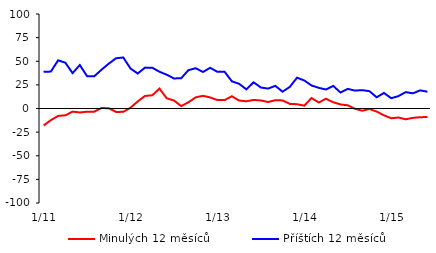
| Category | Minulých 12 měsíců | Příštích 12 měsíců |
|---|---|---|
|  1/11 | -17.96 | 38.89 |
|  2/11 | -12.33 | 39.05 |
|  3/11 | -7.84 | 50.96 |
|  4/11 | -7.2 | 48.47 |
|  5/11 | -3.3 | 37.42 |
|  6/11 | -4.21 | 45.99 |
|  7/11 | -3.33 | 34.17 |
|  8/11 | -3.33 | 34.17 |
|  9/11 | 0.51 | 41.09 |
|  10/11 | 0.28 | 47.47 |
|  11/11 | -3.65 | 53.17 |
|  12/11 | -3.52 | 53.99 |
|  1/12 | 0.85 | 42.3 |
|  2/12 | 7.49 | 37.02 |
|  3/12 | 13.29 | 43.26 |
|  4/12 | 13.96 | 43.14 |
|  5/12 | 21.08 | 38.87 |
|  6/12 | 10.81 | 35.74 |
|  7/12 | 8.46 | 31.81 |
|  8/12 | 2.55 | 32.03 |
|  9/12 | 6.58 | 40.6 |
|  10/12 | 11.79 | 42.65 |
|  11/12 | 13.41 | 38.66 |
|  12/12 | 11.71 | 43.07 |
|  1/13 | 8.92 | 38.82 |
|  2/13 | 8.92 | 38.82 |
|  3/13 | 12.98 | 28.75 |
|  4/13 | 8.4 | 26.12 |
|  5/13 | 7.64 | 20.26 |
|  6/13 | 9.1 | 27.71 |
|  7/13 | 8.51 | 22.2 |
|  8/13 | 6.89 | 21.06 |
|  9/13 | 8.81 | 23.95 |
|  10/13 | 8.54 | 17.76 |
|  11/13 | 4.88 | 22.87 |
|  12/13 | 4.53 | 32.62 |
|  1/14 | 2.99 | 29.64 |
|  2/14 | 11.1 | 24.37 |
|  3/14 | 6.35 | 21.86 |
|  4/14 | 10.34 | 20.09 |
|  5/14 | 6.57 | 23.91 |
|  6/14 | 4.33 | 16.91 |
|  7/14 | 3.35 | 20.75 |
|  8/14 | -0.33 | 18.95 |
|  9/14 | -2.37 | 19.44 |
|  10/14 | -0.5 | 18.32 |
|  11/14 | -3.3 | 11.85 |
|  12/14 | -7.21 | 16.46 |
|  1/15 | -10.32 | 10.88 |
|  2/15 | -9.55 | 13.1 |
|  3/15 | -11.45 | 17.32 |
|  4/15 | -9.85 | 16.04 |
|  5/15 | -9.22 | 19.19 |
|  6/15 | -8.99 | 17.77 |